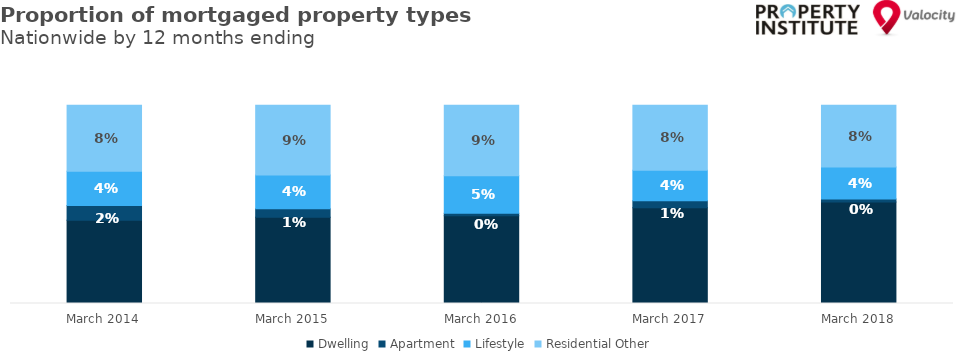
| Category | Dwelling | Apartment | Lifestyle | Residential Other |
|---|---|---|---|---|
| 2014-03-01 | 0.855 | 0.019 | 0.043 | 0.083 |
| 2015-03-01 | 0.859 | 0.011 | 0.042 | 0.088 |
| 2016-03-01 | 0.861 | 0.003 | 0.047 | 0.089 |
| 2017-03-01 | 0.871 | 0.009 | 0.038 | 0.082 |
| 2018-03-01 | 0.878 | 0.004 | 0.04 | 0.078 |